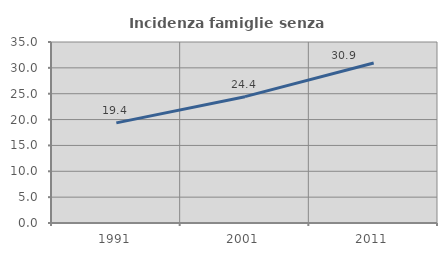
| Category | Incidenza famiglie senza nuclei |
|---|---|
| 1991.0 | 19.362 |
| 2001.0 | 24.429 |
| 2011.0 | 30.949 |